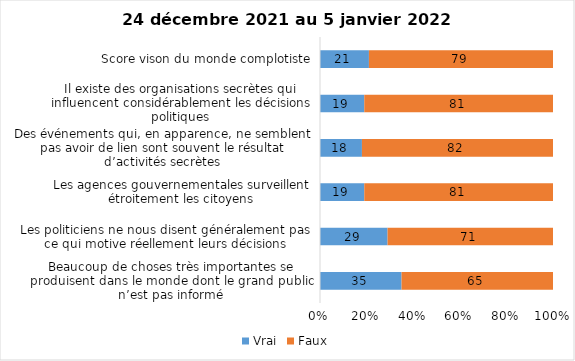
| Category | Vrai | Faux |
|---|---|---|
| Beaucoup de choses très importantes se produisent dans le monde dont le grand public n’est pas informé | 35 | 65 |
| Les politiciens ne nous disent généralement pas ce qui motive réellement leurs décisions | 29 | 71 |
| Les agences gouvernementales surveillent étroitement les citoyens | 19 | 81 |
| Des événements qui, en apparence, ne semblent pas avoir de lien sont souvent le résultat d’activités secrètes | 18 | 82 |
| Il existe des organisations secrètes qui influencent considérablement les décisions politiques | 19 | 81 |
| Score vison du monde complotiste | 21 | 79 |